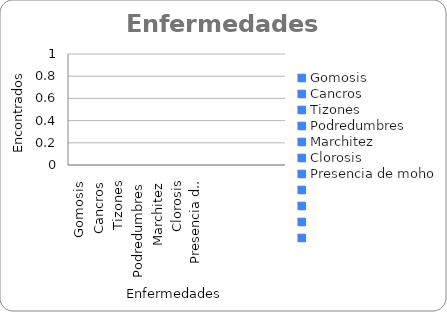
| Category | Series 0 |
|---|---|
| Gomosis | 0 |
| Cancros | 0 |
| Tizones | 0 |
| Podredumbres | 0 |
| Marchitez | 0 |
| Clorosis | 0 |
| Presencia de moho | 0 |